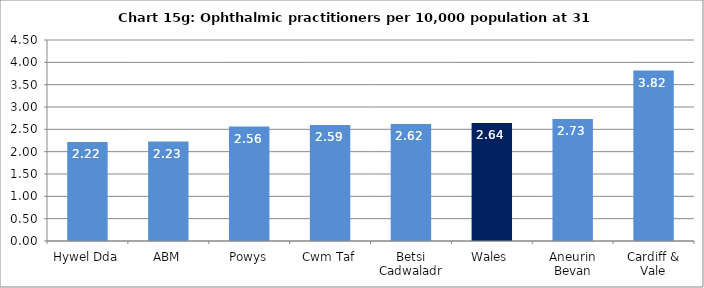
| Category | Chart 15g: Ophthalmic practitioners per 10,000 population at 31 December 2016 |
|---|---|
| Hywel Dda | 2.218 |
| ABM | 2.227 |
| Powys | 2.563 |
| Cwm Taf | 2.595 |
| Betsi Cadwaladr | 2.621 |
| Wales | 2.643 |
| Aneurin Bevan | 2.733 |
| Cardiff & Vale | 3.816 |